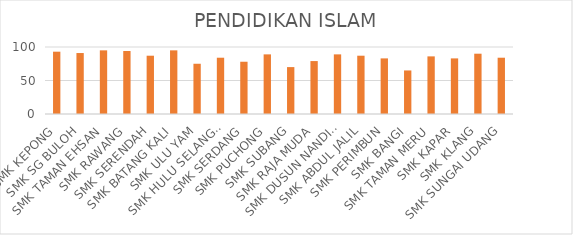
| Category | PENDIDIKAN ISLAM |
|---|---|
| SMK KEPONG | 93 |
| SMK SG BULOH | 91 |
| SMK TAMAN EHSAN | 95 |
| SMK RAWANG | 94 |
| SMK SERENDAH | 87 |
| SMK BATANG KALI | 95 |
| SMK ULU YAM | 75 |
| SMK HULU SELANGOR | 84 |
| SMK SERDANG | 78 |
| SMK PUCHONG | 89 |
| SMK SUBANG | 70 |
| SMK RAJA MUDA | 79 |
| SMK DUSUN NANDING | 89 |
| SMK ABDUL JALIL | 87 |
| SMK PERIMBUN | 83 |
| SMK BANGI | 65 |
| SMK TAMAN MERU | 86 |
| SMK KAPAR | 83 |
| SMK KLANG | 90 |
| SMK SUNGAI UDANG | 84 |